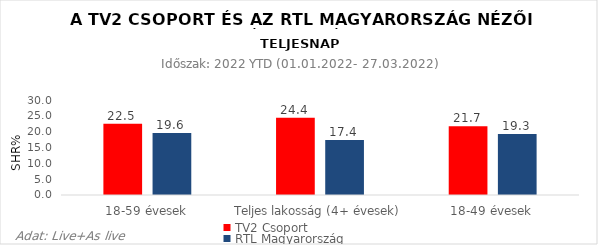
| Category | TV2 Csoport | RTL Magyarország |
|---|---|---|
| 18-59 évesek | 22.5 | 19.6 |
| Teljes lakosság (4+ évesek) | 24.4 | 17.4 |
| 18-49 évesek | 21.7 | 19.3 |